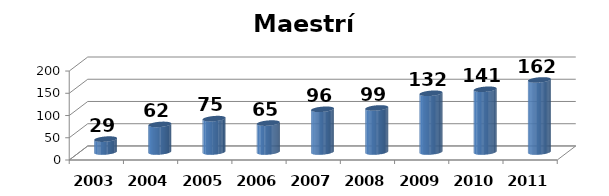
| Category | Maestría |
|---|---|
| 2003.0 | 29 |
| 2004.0 | 62 |
| 2005.0 | 75 |
| 2006.0 | 65 |
| 2007.0 | 96 |
| 2008.0 | 99 |
| 2009.0 | 132 |
| 2010.0 | 141 |
| 2011.0 | 162 |